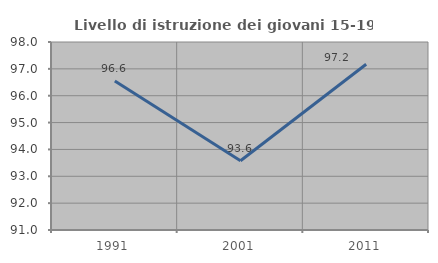
| Category | Livello di istruzione dei giovani 15-19 anni |
|---|---|
| 1991.0 | 96.552 |
| 2001.0 | 93.578 |
| 2011.0 | 97.17 |